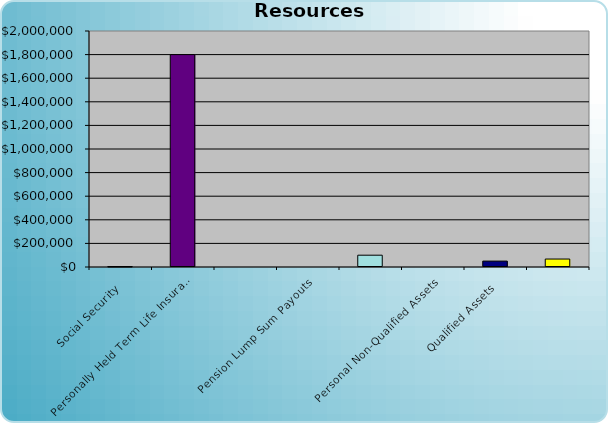
| Category | Series 0 |
|---|---|
| Social Security | 255 |
| Personally Held Term Life Insurance | 1800000 |
|   | 0 |
| Pension Lump Sum Payouts | 0 |
|   | 100000 |
| Personal Non-Qualified Assets | 0 |
| Qualified Assets | 50000 |